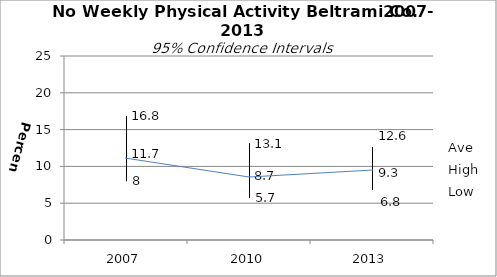
| Category | Ave | High | Low |
|---|---|---|---|
| 2007.0 | 11.7 | 16.8 | 8 |
| 2010.0 | 8.7 | 13.1 | 5.7 |
| 2013.0 | 9.3 | 12.6 | 6.8 |